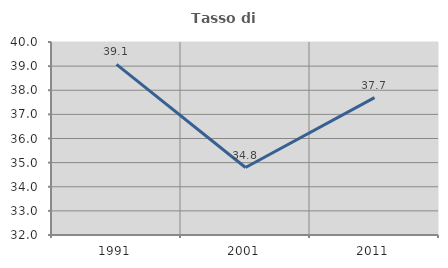
| Category | Tasso di occupazione   |
|---|---|
| 1991.0 | 39.075 |
| 2001.0 | 34.796 |
| 2011.0 | 37.694 |